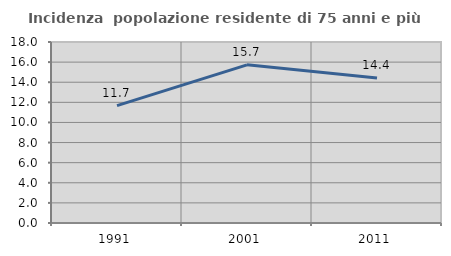
| Category | Incidenza  popolazione residente di 75 anni e più |
|---|---|
| 1991.0 | 11.668 |
| 2001.0 | 15.728 |
| 2011.0 | 14.409 |